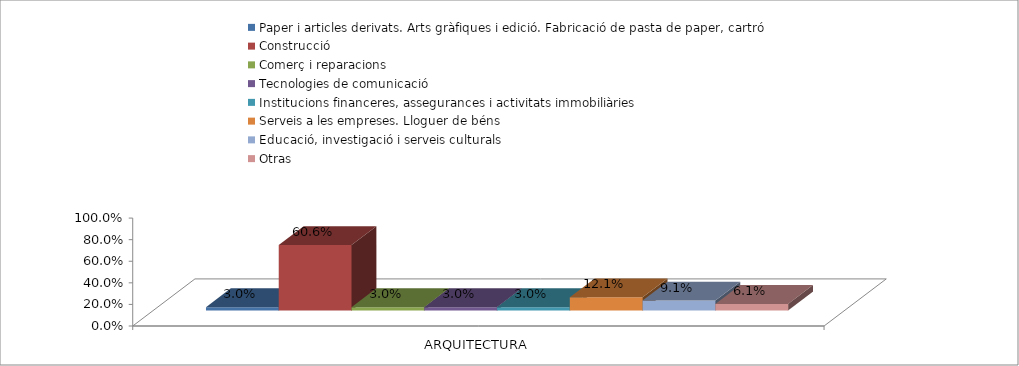
| Category | Paper i articles derivats. Arts gràfiques i edició. Fabricació de pasta de paper, cartró | Construcció | Comerç i reparacions | Tecnologies de comunicació | Institucions financeres, assegurances i activitats immobiliàries | Serveis a les empreses. Lloguer de béns | Educació, investigació i serveis culturals | Otras |
|---|---|---|---|---|---|---|---|---|
| ARQUITECTURA | 0.03 | 0.606 | 0.03 | 0.03 | 0.03 | 0.121 | 0.091 | 0.061 |